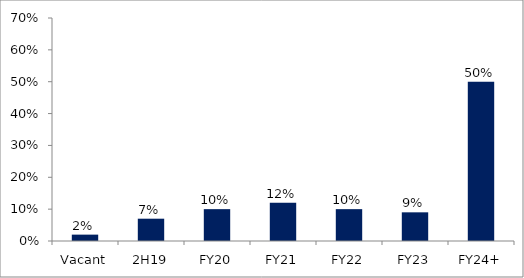
| Category | Series 0 |
|---|---|
| Vacant | 0.02 |
| 2H19 | 0.07 |
| FY20 | 0.1 |
| FY21 | 0.12 |
| FY22 | 0.1 |
| FY23 | 0.09 |
| FY24+ | 0.5 |